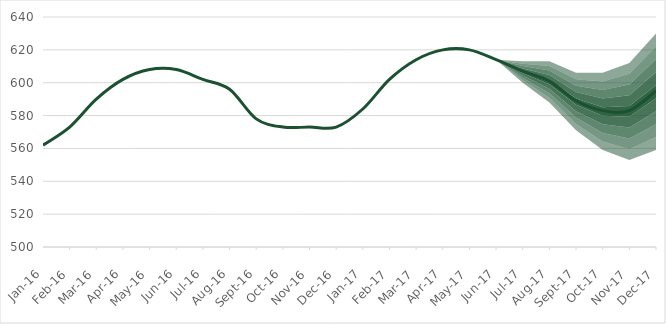
| Category | Result |
|---|---|
| 2016-01-01 | 562 |
| 2016-02-01 | 573 |
| 2016-03-01 | 590 |
| 2016-04-01 | 602 |
| 2016-05-01 | 608 |
| 2016-06-01 | 608 |
| 2016-07-01 | 602 |
| 2016-08-01 | 596 |
| 2016-09-01 | 578 |
| 2016-10-01 | 573 |
| 2016-11-01 | 573 |
| 2016-12-01 | 573 |
| 2017-01-01 | 584 |
| 2017-02-01 | 602 |
| 2017-03-01 | 614 |
| 2017-04-01 | 620 |
| 2017-05-01 | 620 |
| 2017-06-01 | 614 |
| 2017-07-01 | 607 |
| 2017-08-01 | 601 |
| 2017-09-01 | 589 |
| 2017-10-01 | 583 |
| 2017-11-01 | 583 |
| 2017-12-01 | 595 |